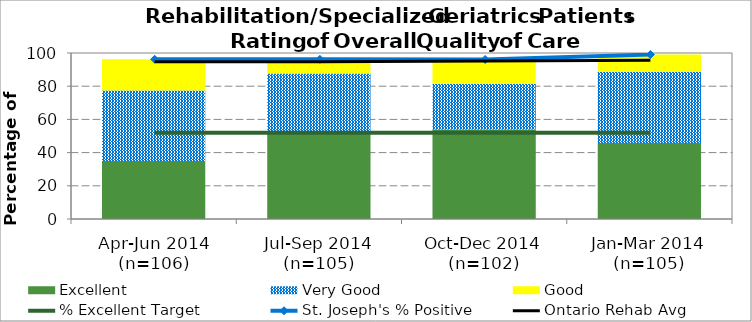
| Category | Excellent | Very Good | Good |
|---|---|---|---|
| Apr-Jun 2014 (n=106) | 34.91 | 42.45 | 18.87 |
| Jul-Sep 2014 (n=105) | 51.43 | 36.19 | 8.57 |
| Oct-Dec 2014 (n=102) | 53.92 | 27.45 | 14.71 |
| Jan-Mar 2014 (n=105) | 45.71 | 42.86 | 10.48 |